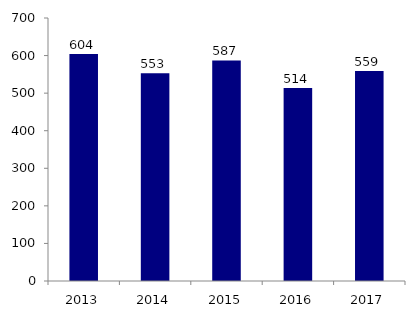
| Category | Nombre de détermination |
|---|---|
| 2013.0 | 604 |
| 2014.0 | 553 |
| 2015.0 | 587 |
| 2016.0 | 514 |
| 2017.0 | 559 |